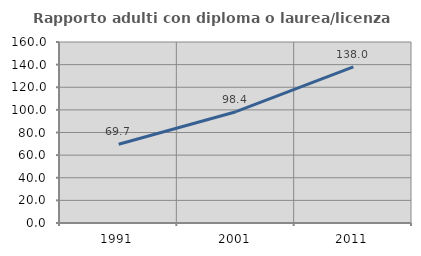
| Category | Rapporto adulti con diploma o laurea/licenza media  |
|---|---|
| 1991.0 | 69.663 |
| 2001.0 | 98.374 |
| 2011.0 | 137.959 |